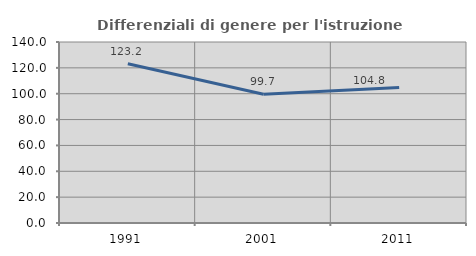
| Category | Differenziali di genere per l'istruzione superiore |
|---|---|
| 1991.0 | 123.233 |
| 2001.0 | 99.653 |
| 2011.0 | 104.8 |